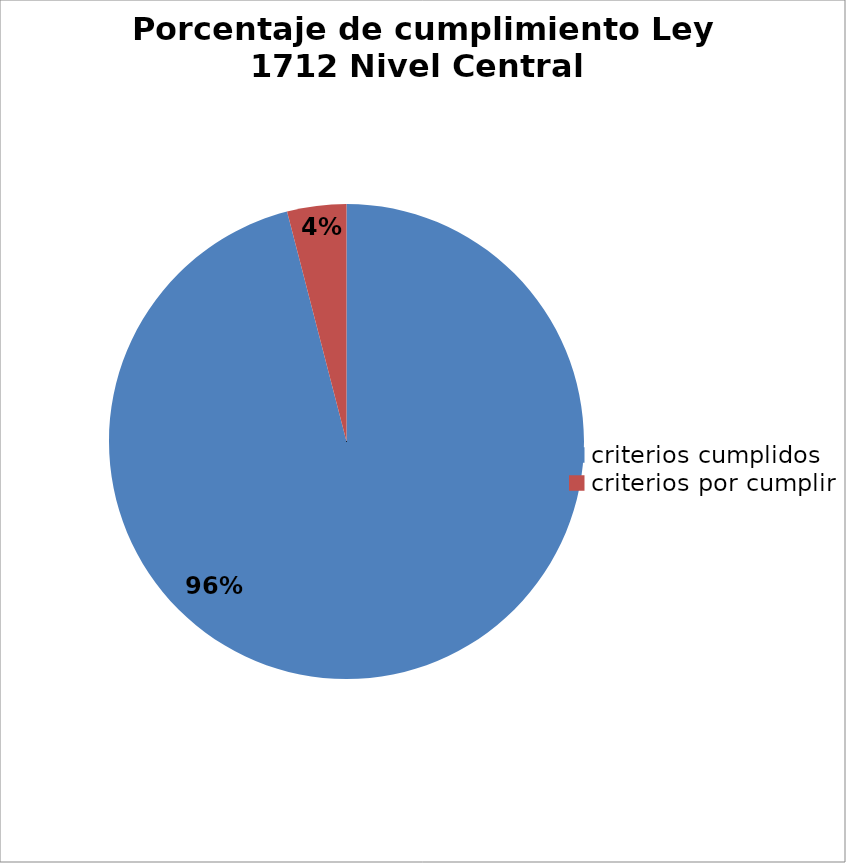
| Category | Series 0 |
|---|---|
| criterios cumplidos | 143 |
| criterios por cumplir | 6 |